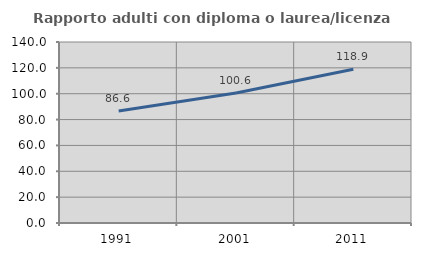
| Category | Rapporto adulti con diploma o laurea/licenza media  |
|---|---|
| 1991.0 | 86.555 |
| 2001.0 | 100.559 |
| 2011.0 | 118.937 |